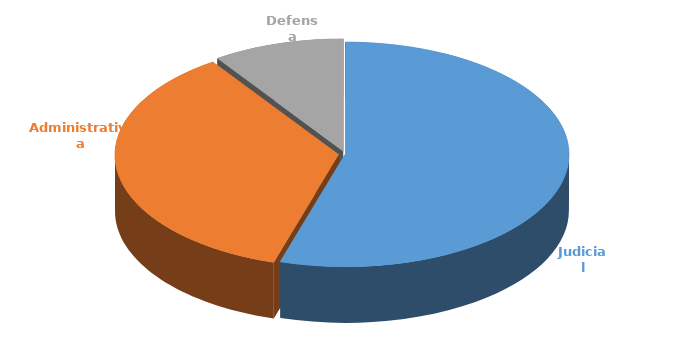
| Category | Cantidad |
|---|---|
| Judicial | 362 |
| Administrativa | 237 |
| Defensa | 63 |